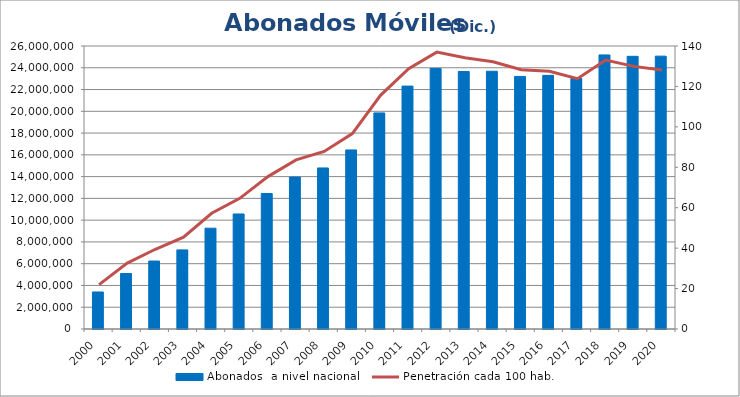
| Category | Abonados  a nivel nacional  |
|---|---|
| 2000.0 | 3401525 |
| 2001.0 | 5100783 |
| 2002.0 | 6244310 |
| 2003.0 | 7268281 |
| 2004.0 | 9261385 |
| 2005.0 | 10569572 |
| 2006.0 | 12450801 |
| 2007.0 | 13955202 |
| 2008.0 | 14796593 |
| 2009.0 | 16450223 |
| 2010.0 | 19852242 |
| 2011.0 | 22315248 |
| 2012.0 | 23940973 |
| 2013.0 | 23661339 |
| 2014.0 | 23680718 |
| 2015.0 | 23206353 |
| 2016.0 | 23302603 |
| 2017.0 | 23013147 |
| 2018.0 | 25178981 |
| 2019.0 | 25051668 |
| 2020.0 | 25068249 |